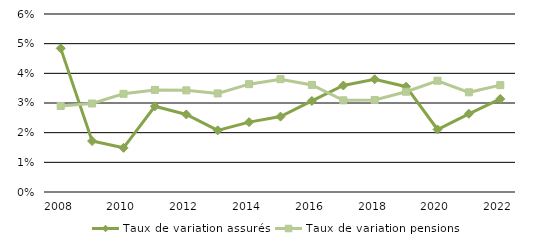
| Category | Taux de variation assurés  | Taux de variation pensions |
|---|---|---|
| 2008.0 | 0.048 | 0.029 |
| 2009.0 | 0.017 | 0.03 |
| 2010.0 | 0.015 | 0.033 |
| 2011.0 | 0.029 | 0.034 |
| 2012.0 | 0.026 | 0.034 |
| 2013.0 | 0.021 | 0.033 |
| 2014.0 | 0.024 | 0.036 |
| 2015.0 | 0.025 | 0.038 |
| 2016.0 | 0.031 | 0.036 |
| 2017.0 | 0.036 | 0.031 |
| 2018.0 | 0.038 | 0.031 |
| 2019.0 | 0.036 | 0.034 |
| 2020.0 | 0.021 | 0.038 |
| 2021.0 | 0.026 | 0.034 |
| 2022.0 | 0.031 | 0.036 |